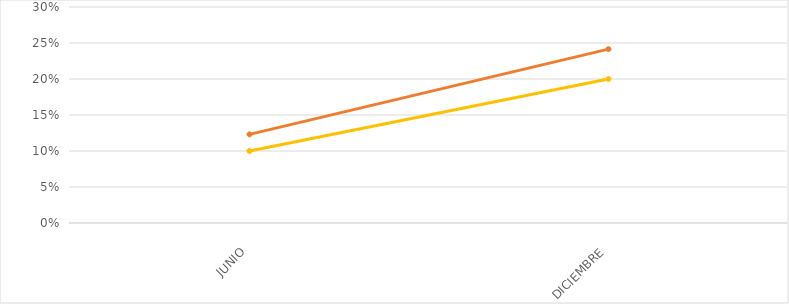
| Category | VALOR  | META PONDERADA |
|---|---|---|
| JUNIO | 0.123 | 0.1 |
| DICIEMBRE | 0.242 | 0.2 |